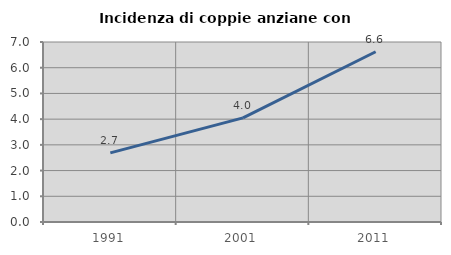
| Category | Incidenza di coppie anziane con figli |
|---|---|
| 1991.0 | 2.69 |
| 2001.0 | 4.049 |
| 2011.0 | 6.62 |